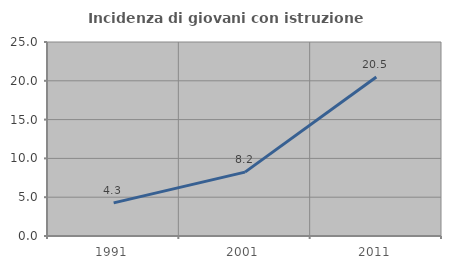
| Category | Incidenza di giovani con istruzione universitaria |
|---|---|
| 1991.0 | 4.265 |
| 2001.0 | 8.232 |
| 2011.0 | 20.5 |